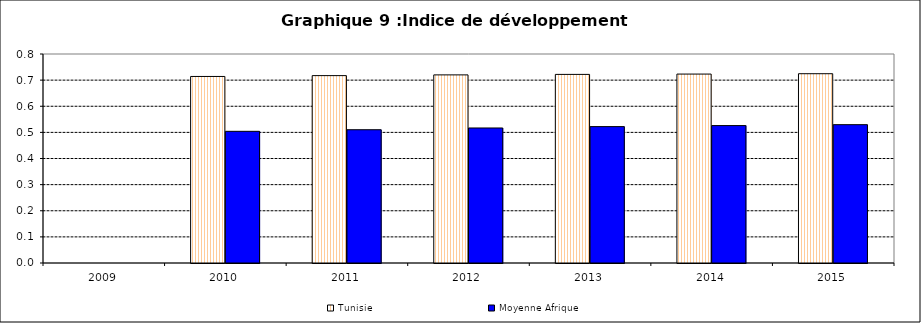
| Category | Tunisie | Moyenne Afrique |
|---|---|---|
| 2009.0 | 0 | 0 |
| 2010.0 | 0.714 | 0.504 |
| 2011.0 | 0.717 | 0.51 |
| 2012.0 | 0.72 | 0.517 |
| 2013.0 | 0.722 | 0.522 |
| 2014.0 | 0.723 | 0.526 |
| 2015.0 | 0.725 | 0.53 |